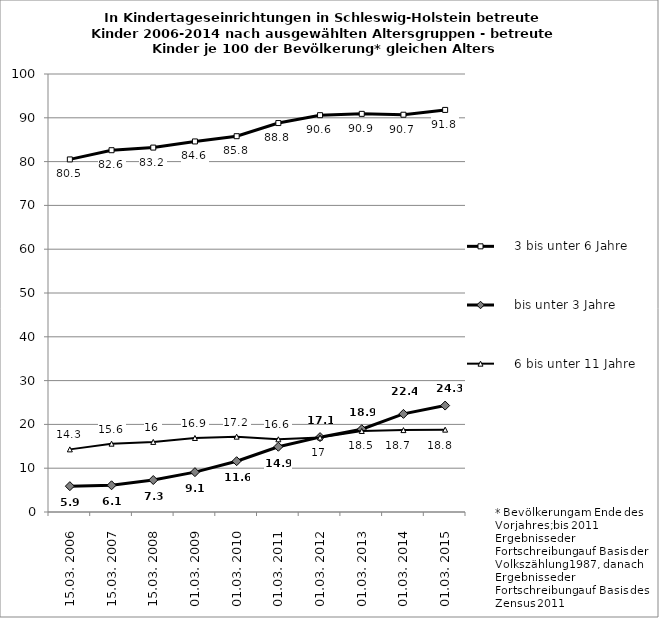
| Category |     3 bis unter 6 Jahre |     bis unter 3 Jahre |     6 bis unter 11 Jahre |
|---|---|---|---|
| 15.03. 2006 | 80.5 | 5.9 | 14.3 |
| 15.03. 2007 | 82.6 | 6.1 | 15.6 |
| 15.03. 2008 | 83.2 | 7.3 | 16 |
| 01.03. 2009 | 84.6 | 9.1 | 16.9 |
| 01.03. 2010 | 85.8 | 11.6 | 17.2 |
| 01.03. 2011 | 88.8 | 14.9 | 16.6 |
| 01.03. 2012 | 90.6 | 17.1 | 17 |
| 01.03. 2013 | 90.9 | 18.9 | 18.5 |
| 01.03. 2014 | 90.7 | 22.4 | 18.7 |
| 01.03. 2015 | 91.8 | 24.3 | 18.8 |